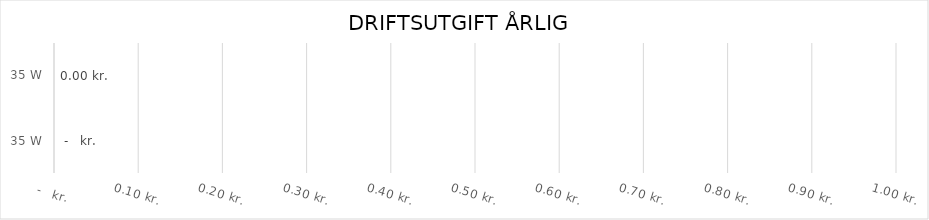
| Category | ENERGIUTGIFT ÅRLIG KR./KWH  |
|---|---|
| 35.0 | 0 |
| 35.0 | 0 |